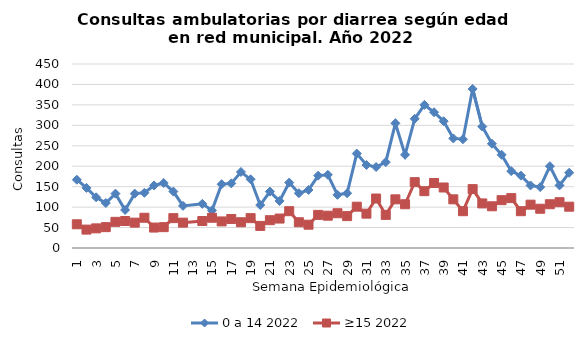
| Category | 0 a 14 2022 | ≥15 2022 |
|---|---|---|
| 1.0 | 167 | 58 |
| 2.0 | 147 | 45 |
| 3.0 | 124 | 48 |
| 4.0 | 110 | 51 |
| 5.0 | 133 | 64 |
| 6.0 | 93 | 66 |
| 7.0 | 133 | 62 |
| 8.0 | 135 | 74 |
| 9.0 | 153 | 50 |
| 10.0 | 159 | 51 |
| 11.0 | 138 | 73 |
| 12.0 | 103 | 62 |
| 14.0 | 108 | 66 |
| 15.0 | 92 | 74 |
| 16.0 | 156 | 65 |
| 17.0 | 158 | 71 |
| 18.0 | 186 | 63 |
| 19.0 | 168 | 73 |
| 20.0 | 105 | 54 |
| 21.0 | 138 | 68 |
| 22.0 | 115 | 72 |
| 23.0 | 160 | 90 |
| 24.0 | 134 | 63 |
| 25.0 | 142 | 57 |
| 26.0 | 177 | 81 |
| 27.0 | 179 | 79 |
| 28.0 | 130 | 85 |
| 29.0 | 134 | 78 |
| 30.0 | 231 | 101 |
| 31.0 | 203 | 84 |
| 32.0 | 198 | 121 |
| 33.0 | 210 | 81 |
| 34.0 | 305 | 119 |
| 35.0 | 228 | 107 |
| 36.0 | 316 | 161 |
| 37.0 | 350 | 139 |
| 38.0 | 332 | 159 |
| 39.0 | 310 | 148 |
| 40.0 | 268 | 119 |
| 41.0 | 266 | 90 |
| 42.0 | 389 | 144 |
| 43.0 | 297 | 109 |
| 44.0 | 255 | 102 |
| 45.0 | 228 | 117 |
| 46.0 | 188 | 122 |
| 47.0 | 177 | 90 |
| 48.0 | 153 | 106 |
| 49.0 | 149 | 96 |
| 50.0 | 200 | 107 |
| 51.0 | 153 | 112 |
| 52.0 | 184 | 101 |